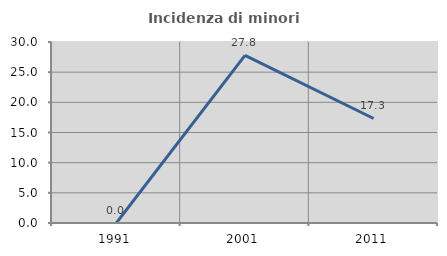
| Category | Incidenza di minori stranieri |
|---|---|
| 1991.0 | 0 |
| 2001.0 | 27.778 |
| 2011.0 | 17.323 |